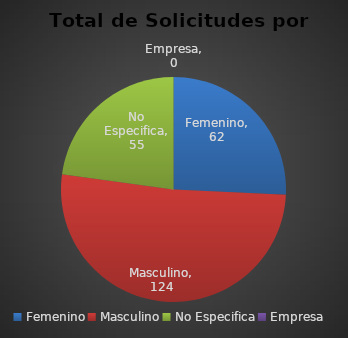
| Category | Series 0 |
|---|---|
| Femenino | 62 |
| Masculino | 124 |
| No Especifica | 55 |
| Empresa | 0 |